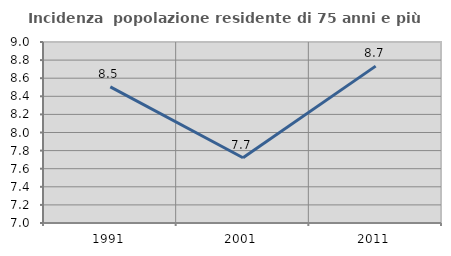
| Category | Incidenza  popolazione residente di 75 anni e più |
|---|---|
| 1991.0 | 8.504 |
| 2001.0 | 7.721 |
| 2011.0 | 8.733 |